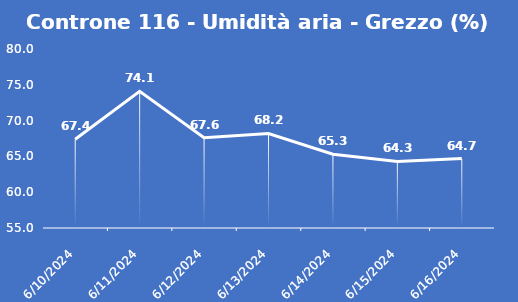
| Category | Controne 116 - Umidità aria - Grezzo (%) |
|---|---|
| 6/10/24 | 67.4 |
| 6/11/24 | 74.1 |
| 6/12/24 | 67.6 |
| 6/13/24 | 68.2 |
| 6/14/24 | 65.3 |
| 6/15/24 | 64.3 |
| 6/16/24 | 64.7 |